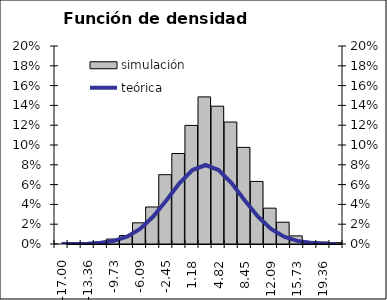
| Category | simulación |
|---|---|
| -17.0 | 0 |
| -15.181818181818182 | 0 |
| -13.363636363636363 | 0.001 |
| -11.545454545454545 | 0.001 |
| -9.727272727272727 | 0.005 |
| -7.909090909090908 | 0.009 |
| -6.09090909090909 | 0.021 |
| -4.272727272727272 | 0.037 |
| -2.4545454545454533 | 0.07 |
| -0.6363636363636351 | 0.091 |
| 1.181818181818183 | 0.12 |
| 3.000000000000001 | 0.149 |
| 4.818181818181819 | 0.139 |
| 6.636363636363638 | 0.123 |
| 8.454545454545455 | 0.098 |
| 10.272727272727273 | 0.063 |
| 12.090909090909092 | 0.036 |
| 13.90909090909091 | 0.022 |
| 15.727272727272728 | 0.008 |
| 17.545454545454547 | 0.003 |
| 19.363636363636363 | 0.002 |
| 23.0 | 0.001 |